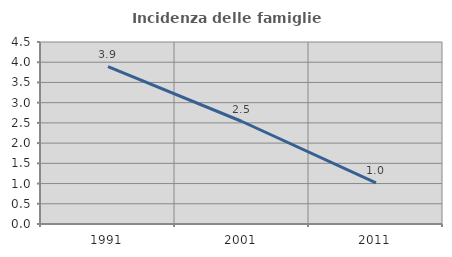
| Category | Incidenza delle famiglie numerose |
|---|---|
| 1991.0 | 3.893 |
| 2001.0 | 2.534 |
| 2011.0 | 1.019 |